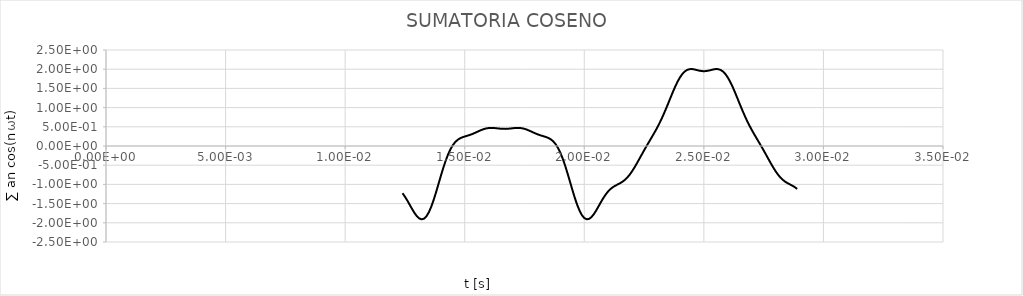
| Category | ∑ an cos(nωt) |
|---|---|
| 0.0124 | -1.231 |
| 0.0125 | -1.319 |
| 0.0126 | -1.42 |
| 0.0127 | -1.53 |
| 0.0128 | -1.641 |
| 0.0129 | -1.744 |
| 0.013 | -1.829 |
| 0.0131 | -1.886 |
| 0.0132 | -1.909 |
| 0.0133 | -1.892 |
| 0.0134 | -1.83 |
| 0.0135 | -1.726 |
| 0.0136 | -1.583 |
| 0.0137 | -1.407 |
| 0.0138 | -1.208 |
| 0.0139 | -0.996 |
| 0.014 | -0.783 |
| 0.0141 | -0.578 |
| 0.0142 | -0.39 |
| 0.0143 | -0.226 |
| 0.0144 | -0.089 |
| 0.0145 | 0.019 |
| 0.0146 | 0.1 |
| 0.0147 | 0.159 |
| 0.0148 | 0.199 |
| 0.0149 | 0.226 |
| 0.015 | 0.247 |
| 0.0151 | 0.266 |
| 0.0152 | 0.285 |
| 0.0153 | 0.308 |
| 0.0154 | 0.334 |
| 0.0155 | 0.362 |
| 0.0156 | 0.391 |
| 0.0157 | 0.418 |
| 0.0158 | 0.441 |
| 0.0159 | 0.458 |
| 0.016 | 0.468 |
| 0.0161 | 0.472 |
| 0.0162 | 0.47 |
| 0.0163 | 0.464 |
| 0.0164 | 0.457 |
| 0.0165 | 0.45 |
| 0.0166 | 0.446 |
| 0.0167 | 0.446 |
| 0.0168 | 0.449 |
| 0.0169 | 0.455 |
| 0.017 | 0.462 |
| 0.0171 | 0.468 |
| 0.0172 | 0.472 |
| 0.0173 | 0.47 |
| 0.0174 | 0.462 |
| 0.0175 | 0.447 |
| 0.0176 | 0.426 |
| 0.0177 | 0.4 |
| 0.0178 | 0.372 |
| 0.0179 | 0.343 |
| 0.018 | 0.316 |
| 0.0181 | 0.292 |
| 0.0182 | 0.272 |
| 0.0183 | 0.253 |
| 0.0184 | 0.234 |
| 0.0185 | 0.209 |
| 0.0186 | 0.174 |
| 0.0187 | 0.122 |
| 0.0188 | 0.049 |
| 0.0189 | -0.05 |
| 0.019 | -0.177 |
| 0.0191 | -0.332 |
| 0.0192 | -0.513 |
| 0.0193 | -0.713 |
| 0.0194 | -0.925 |
| 0.0195 | -1.138 |
| 0.0196 | -1.343 |
| 0.0197 | -1.527 |
| 0.0198 | -1.682 |
| 0.0199 | -1.8 |
| 0.02 | -1.876 |
| 0.0201 | -1.908 |
| 0.0202 | -1.898 |
| 0.0203 | -1.851 |
| 0.0204 | -1.774 |
| 0.0205 | -1.677 |
| 0.0206 | -1.568 |
| 0.0207 | -1.457 |
| 0.0208 | -1.351 |
| 0.0209 | -1.258 |
| 0.021 | -1.18 |
| 0.0211 | -1.118 |
| 0.0212 | -1.07 |
| 0.0213 | -1.033 |
| 0.0214 | -1 |
| 0.0215 | -0.968 |
| 0.0216 | -0.929 |
| 0.0217 | -0.881 |
| 0.0218 | -0.82 |
| 0.0219 | -0.745 |
| 0.022 | -0.657 |
| 0.0221 | -0.558 |
| 0.0222 | -0.45 |
| 0.0223 | -0.339 |
| 0.0224 | -0.226 |
| 0.0225 | -0.115 |
| 0.0226 | -0.006 |
| 0.0227 | 0.1 |
| 0.0228 | 0.206 |
| 0.0229 | 0.312 |
| 0.023 | 0.422 |
| 0.0231 | 0.539 |
| 0.0232 | 0.664 |
| 0.0233 | 0.8 |
| 0.0234 | 0.944 |
| 0.0235 | 1.095 |
| 0.0236 | 1.249 |
| 0.0237 | 1.4 |
| 0.0238 | 1.544 |
| 0.0239 | 1.674 |
| 0.024 | 1.785 |
| 0.0241 | 1.875 |
| 0.0242 | 1.94 |
| 0.0243 | 1.981 |
| 0.0244 | 2.001 |
| 0.0245 | 2.004 |
| 0.0246 | 1.995 |
| 0.0247 | 1.979 |
| 0.0248 | 1.963 |
| 0.0249 | 1.952 |
| 0.025 | 1.948 |
| 0.0251 | 1.952 |
| 0.0252 | 1.963 |
| 0.0253 | 1.979 |
| 0.0254 | 1.995 |
| 0.0255 | 2.004 |
| 0.0256 | 2.001 |
| 0.0257 | 1.981 |
| 0.0258 | 1.94 |
| 0.0259 | 1.875 |
| 0.026 | 1.785 |
| 0.0261 | 1.674 |
| 0.0262 | 1.544 |
| 0.0263 | 1.4 |
| 0.0264 | 1.249 |
| 0.0265 | 1.095 |
| 0.0266 | 0.944 |
| 0.0267 | 0.8 |
| 0.0268 | 0.664 |
| 0.0269 | 0.539 |
| 0.027 | 0.422 |
| 0.0271 | 0.312 |
| 0.0272 | 0.206 |
| 0.0273 | 0.1 |
| 0.0274 | -0.006 |
| 0.0275 | -0.115 |
| 0.0276 | -0.226 |
| 0.0277 | -0.339 |
| 0.0278 | -0.45 |
| 0.0279 | -0.558 |
| 0.028 | -0.657 |
| 0.0281 | -0.745 |
| 0.0282 | -0.82 |
| 0.0283 | -0.881 |
| 0.0284 | -0.929 |
| 0.0285 | -0.968 |
| 0.0286 | -1 |
| 0.0287 | -1.033 |
| 0.0288 | -1.07 |
| 0.0289 | -1.118 |